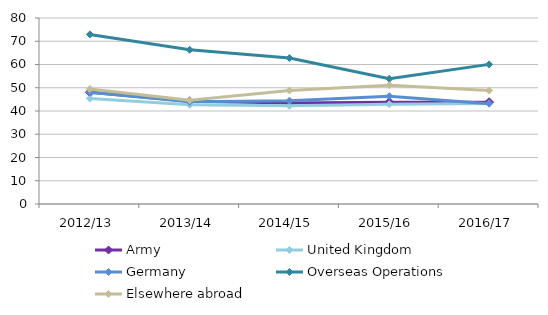
| Category | Army | United Kingdom | Germany | Overseas Operations | Elsewhere abroad |
|---|---|---|---|---|---|
| 2012/13 | 48.066 | 45.411 | 48.034 | 72.944 | 49.451 |
| 2013/14 | 44.186 | 42.676 | 43.929 | 66.327 | 44.582 |
| 2014/15 | 43.392 | 42.211 | 44.413 | 62.765 | 48.832 |
| 2015/16 | 43.744 | 42.919 | 46.347 | 53.849 | 51.119 |
| 2016/17 | 43.803 | 43.24 | 43.153 | 60.05 | 48.833 |